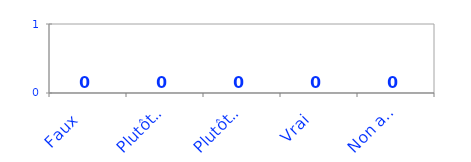
| Category | Series 0 |
|---|---|
| Faux  | 0 |
| Plutôt Faux | 0 |
| Plutôt Vrai | 0 |
| Vrai  | 0 |
| Non applicable | 0 |